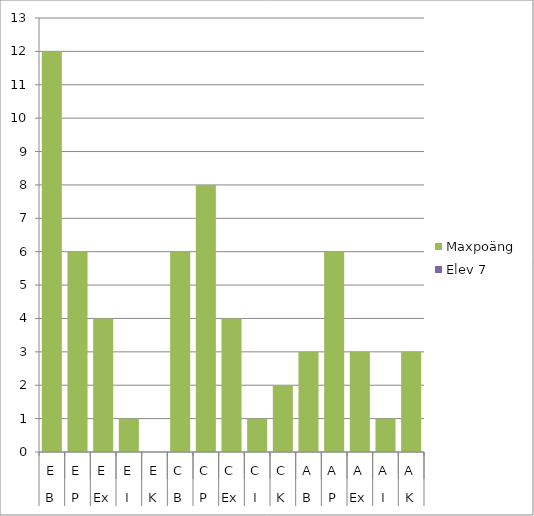
| Category | Maxpoäng | Elev 7 |
|---|---|---|
| 0 | 12 | 0 |
| 1 | 6 | 0 |
| 2 | 4 | 0 |
| 3 | 1 | 0 |
| 4 | 0 | 0 |
| 5 | 6 | 0 |
| 6 | 8 | 0 |
| 7 | 4 | 0 |
| 8 | 1 | 0 |
| 9 | 2 | 0 |
| 10 | 3 | 0 |
| 11 | 6 | 0 |
| 12 | 3 | 0 |
| 13 | 1 | 0 |
| 14 | 3 | 0 |